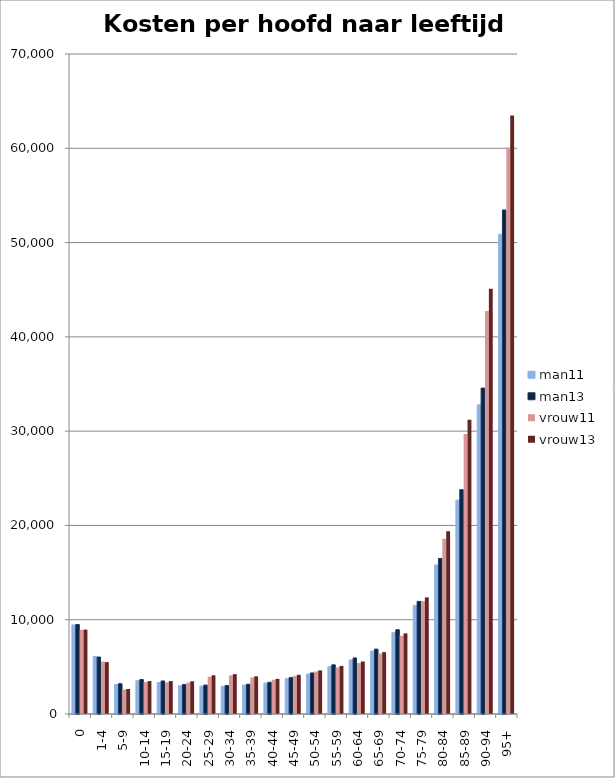
| Category | man11 | man13 | vrouw11 | vrouw13 |
|---|---|---|---|---|
| 0 | 9444.474 | 9491.97 | 8924.805 | 8953.297 |
| 1-4 | 6090.86 | 6043.257 | 5578.316 | 5505.729 |
| 5-9 | 3134.511 | 3212.697 | 2596.145 | 2652.966 |
| 10-14 | 3534.443 | 3654.42 | 3389.807 | 3489.348 |
| 15-19 | 3341.562 | 3503.435 | 3356.396 | 3493.706 |
| 20-24 | 2986.973 | 3131.324 | 3328.265 | 3470.767 |
| 25-29 | 2951.949 | 3071.58 | 3956.122 | 4108.336 |
| 30-34 | 2928.773 | 3023.606 | 4094.725 | 4227.536 |
| 35-39 | 3066.217 | 3158.515 | 3879.182 | 3994.105 |
| 40-44 | 3271.362 | 3367.206 | 3632.473 | 3726.659 |
| 45-49 | 3743.758 | 3857.077 | 4049.22 | 4159.958 |
| 50-54 | 4221.712 | 4354.786 | 4507.1 | 4623.887 |
| 55-59 | 5026.314 | 5214.464 | 4946.066 | 5099.261 |
| 60-64 | 5728.481 | 5946.372 | 5393.421 | 5567.788 |
| 65-69 | 6668.976 | 6884.787 | 6412.214 | 6564.558 |
| 70-74 | 8623.834 | 8938.568 | 8297.454 | 8548.435 |
| 75-79 | 11491.113 | 11942.248 | 11968.494 | 12367.724 |
| 80-84 | 15805.847 | 16499.781 | 18592.772 | 19387.873 |
| 85-89 | 22683.129 | 23792.787 | 29702.718 | 31207.583 |
| 90-94 | 32786.175 | 34566.957 | 42752.209 | 45098.641 |
| 95+ | 50891.201 | 53456.595 | 60066.123 | 63469.917 |